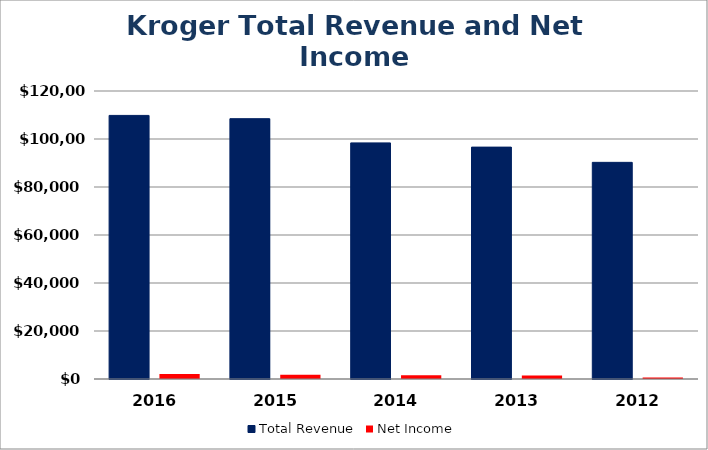
| Category |  Total Revenue  |  Net Income  |
|---|---|---|
| 2016.0 | 109830 | 2039 |
| 2015.0 | 108465 | 1728 |
| 2014.0 | 98375 | 1519 |
| 2013.0 | 96619 | 1497 |
| 2012.0 | 90269 | 602 |